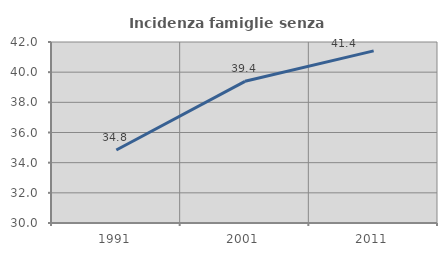
| Category | Incidenza famiglie senza nuclei |
|---|---|
| 1991.0 | 34.84 |
| 2001.0 | 39.394 |
| 2011.0 | 41.412 |